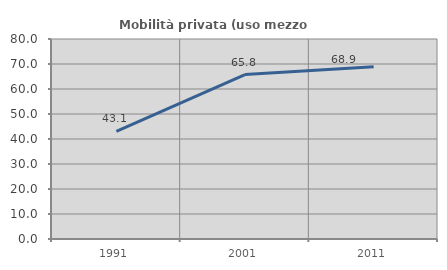
| Category | Mobilità privata (uso mezzo privato) |
|---|---|
| 1991.0 | 43.075 |
| 2001.0 | 65.777 |
| 2011.0 | 68.863 |